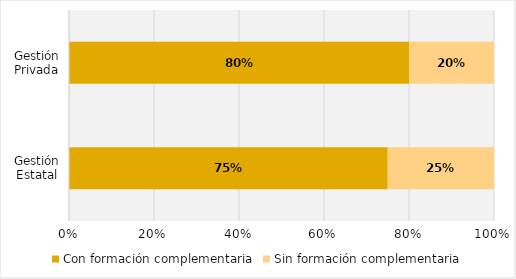
| Category | Con formación complementaria | Sin formación complementaria |
|---|---|---|
| Gestión Estatal | 0.75 | 0.25 |
| Gestión Privada | 0.8 | 0.2 |